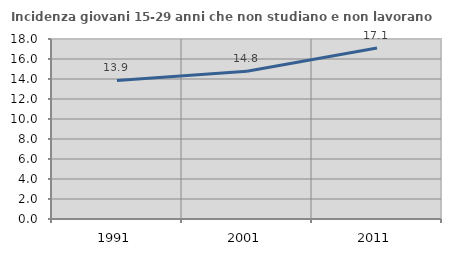
| Category | Incidenza giovani 15-29 anni che non studiano e non lavorano  |
|---|---|
| 1991.0 | 13.858 |
| 2001.0 | 14.783 |
| 2011.0 | 17.105 |